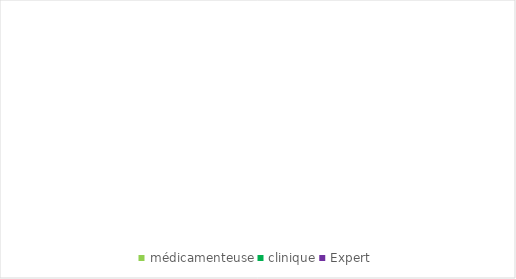
| Category | Series 0 |
|---|---|
| médicamenteuse | 0 |
| clinique | 0 |
| Expert | 0 |